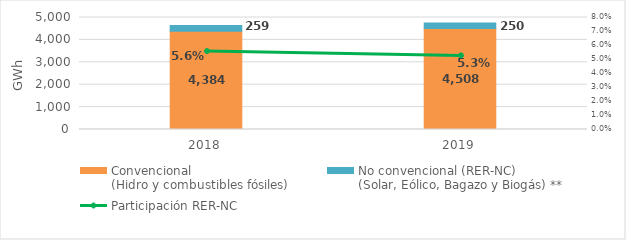
| Category | Convencional
(Hidro y combustibles fósiles) | No convencional (RER-NC)
(Solar, Eólico, Bagazo y Biogás) ** |
|---|---|---|
| 2018.0 | 4384.342 | 258.638 |
| 2019.0 | 4507.601 | 250.166 |